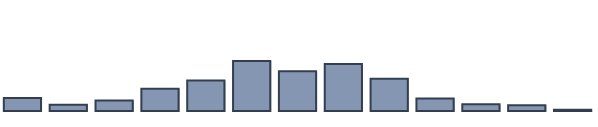
| Category | Series 0 |
|---|---|
| 0 | 4.651 |
| 1 | 2.243 |
| 2 | 3.756 |
| 3 | 8.003 |
| 4 | 10.966 |
| 5 | 18.017 |
| 6 | 14.337 |
| 7 | 16.895 |
| 8 | 11.663 |
| 9 | 4.48 |
| 10 | 2.393 |
| 11 | 2.101 |
| 12 | 0.495 |